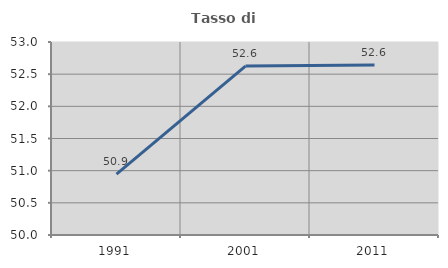
| Category | Tasso di occupazione   |
|---|---|
| 1991.0 | 50.946 |
| 2001.0 | 52.626 |
| 2011.0 | 52.644 |